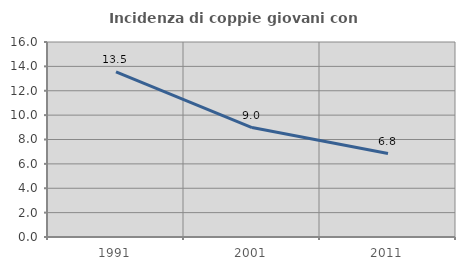
| Category | Incidenza di coppie giovani con figli |
|---|---|
| 1991.0 | 13.542 |
| 2001.0 | 8.98 |
| 2011.0 | 6.847 |